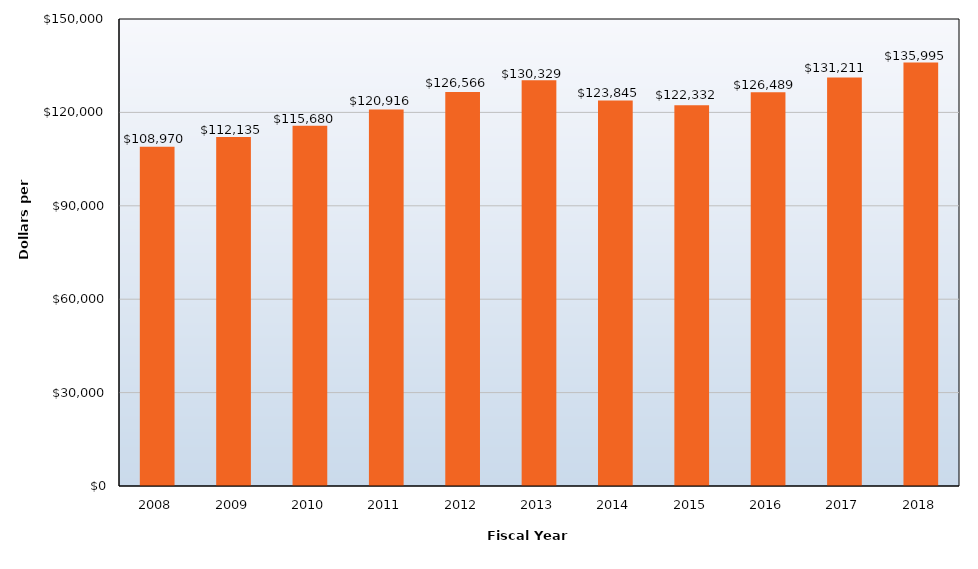
| Category | Total Revenue |
|---|---|
| 2008.0 | 108970 |
| 2009.0 | 112135 |
| 2010.0 | 115680 |
| 2011.0 | 120916 |
| 2012.0 | 126566 |
| 2013.0 | 130329 |
| 2014.0 | 123845 |
| 2015.0 | 122332 |
| 2016.0 | 126489 |
| 2017.0 | 131211 |
| 2018.0 | 135995 |